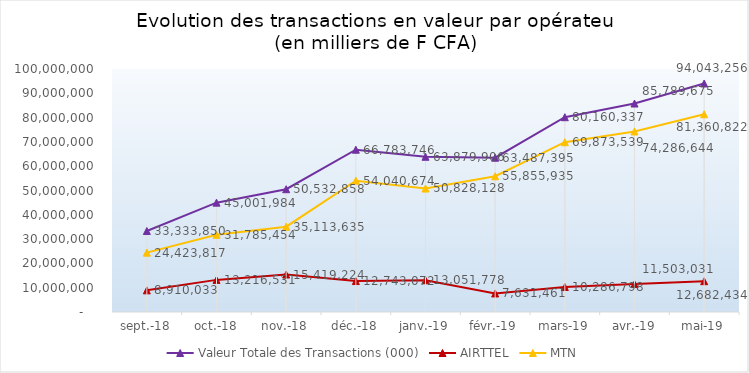
| Category | Valeur Totale des Transactions (000) | AIRTTEL | MTN |
|---|---|---|---|
| 2018-09-01 | 33333850.436 | 8910032.956 | 24423817.48 |
| 2018-10-01 | 45001984.358 | 13216530.585 | 31785453.773 |
| 2018-11-01 | 50532858.364 | 15419223.723 | 35113634.641 |
| 2018-12-01 | 66783745.765 | 12743071.938 | 54040673.827 |
| 2019-01-01 | 63879906.229 | 13051778.479 | 50828127.75 |
| 2019-02-01 | 63487395.452 | 7631460.71 | 55855934.742 |
| 2019-03-01 | 80160336.912 | 10286797.824 | 69873539.088 |
| 2019-04-01 | 85789674.788 | 11503030.616 | 74286644.172 |
| 2019-05-01 | 94043256 | 12682433.828 | 81360822.172 |